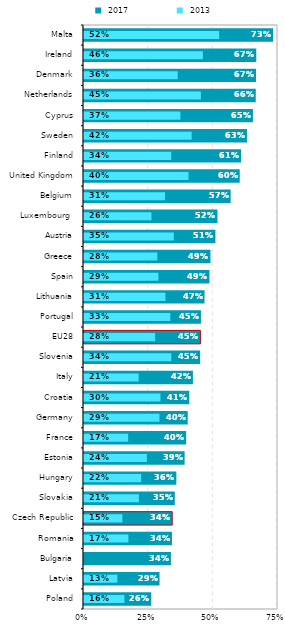
| Category |  2017 |
|---|---|
| Poland | 0.26 |
| Latvia | 0.292 |
| Bulgaria | 0.336 |
| Romania | 0.34 |
| Czech Republic | 0.341 |
| Slovakia | 0.351 |
| Hungary | 0.357 |
| Estonia | 0.389 |
| France | 0.395 |
| Germany | 0.401 |
| Croatia | 0.407 |
| Italy | 0.421 |
| Slovenia | 0.449 |
| EU28 | 0.45 |
| Portugal | 0.452 |
| Lithuania | 0.466 |
| Spain | 0.485 |
| Greece | 0.489 |
| Austria | 0.508 |
| Luxembourg  | 0.516 |
| Belgium | 0.567 |
| United Kingdom | 0.602 |
| Finland | 0.607 |
| Sweden | 0.63 |
| Cyprus | 0.653 |
| Netherlands | 0.664 |
| Denmark | 0.665 |
| Ireland | 0.666 |
| Malta | 0.731 |